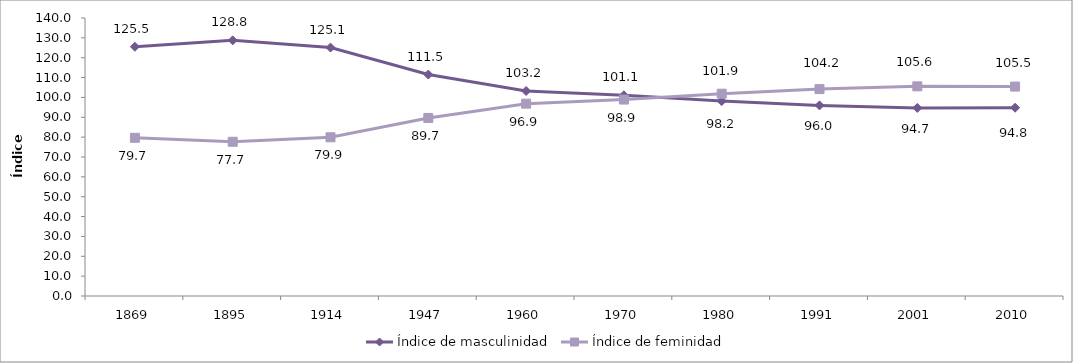
| Category | Índice de masculinidad | Índice de feminidad |
|---|---|---|
| 1869.0 | 125.513 | 79.673 |
| 1895.0 | 128.759 | 77.664 |
| 1914.0 | 125.114 | 79.927 |
| 1947.0 | 111.518 | 89.671 |
| 1960.0 | 103.235 | 96.866 |
| 1970.0 | 101.073 | 98.938 |
| 1980.0 | 98.157 | 101.877 |
| 1991.0 | 95.973 | 104.196 |
| 2001.0 | 94.713 | 105.582 |
| 2010.0 | 94.814 | 105.469 |